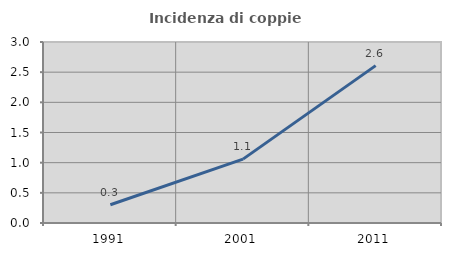
| Category | Incidenza di coppie miste |
|---|---|
| 1991.0 | 0.303 |
| 2001.0 | 1.059 |
| 2011.0 | 2.609 |